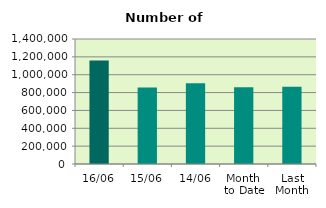
| Category | Series 0 |
|---|---|
| 16/06 | 1159964 |
| 15/06 | 857494 |
| 14/06 | 905084 |
| Month 
to Date | 858704.667 |
| Last
Month | 864947.182 |